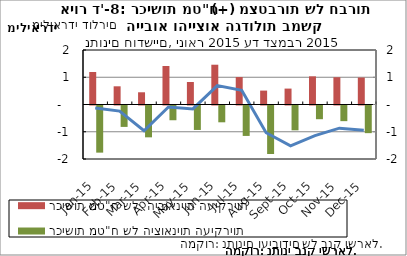
| Category | רכישות מט"ח של  היבואניות העיקריות | רכישות מט"ח של היצואניות העיקריות |
|---|---|---|
| 2015-01-01 | 1191.953 | -1729.724 |
| 2015-02-01 | 667.917 | -785.551 |
| 2015-03-01 | 448.415 | -1168.218 |
| 2015-04-01 | 1413.703 | -540.996 |
| 2015-05-01 | 825.199 | -897.415 |
| 2015-06-01 | 1459.966 | -616.522 |
| 2015-07-01 | 1007.821 | -1116.698 |
| 2015-08-01 | 510.272 | -1780.389 |
| 2015-09-01 | 583.956 | -910.819 |
| 2015-10-01 | 1033.868 | -502.974 |
| 2015-11-01 | 1001.065 | -574.383 |
| 2015-12-01 | 990.075 | -1014.57 |